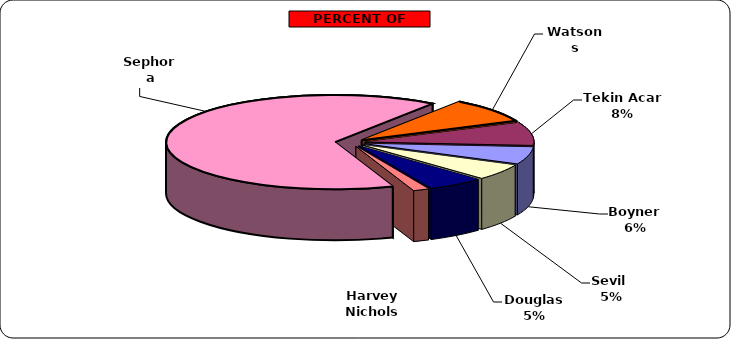
| Category | Series 0 |
|---|---|
| Sephora | 33224 |
| Watsons | 4305 |
| Tekin Acar  | 4008 |
| Boyner | 2993 |
| Sevil  | 2786 |
| Douglas  | 2750 |
| Harvey Nichols | 769 |